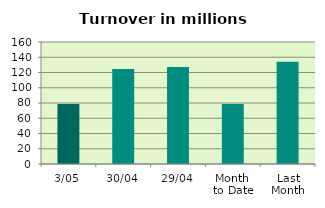
| Category | Series 0 |
|---|---|
| 3/05 | 78.825 |
| 30/04 | 124.662 |
| 29/04 | 127.152 |
| Month 
to Date | 78.825 |
| Last
Month | 133.981 |